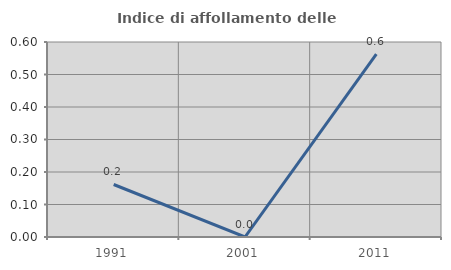
| Category | Indice di affollamento delle abitazioni  |
|---|---|
| 1991.0 | 0.162 |
| 2001.0 | 0 |
| 2011.0 | 0.563 |